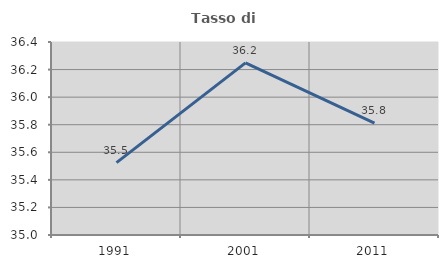
| Category | Tasso di occupazione   |
|---|---|
| 1991.0 | 35.525 |
| 2001.0 | 36.248 |
| 2011.0 | 35.811 |